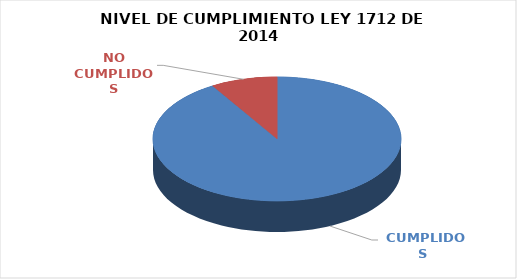
| Category | Series 0 |
|---|---|
|  CUMPLIDOS | 105 |
| NO CUMPLIDOS | 10 |